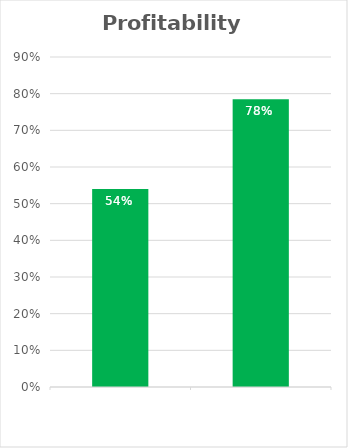
| Category | Profit % |
|---|---|
| 0 | 0.54 |
| 1 | 0.785 |